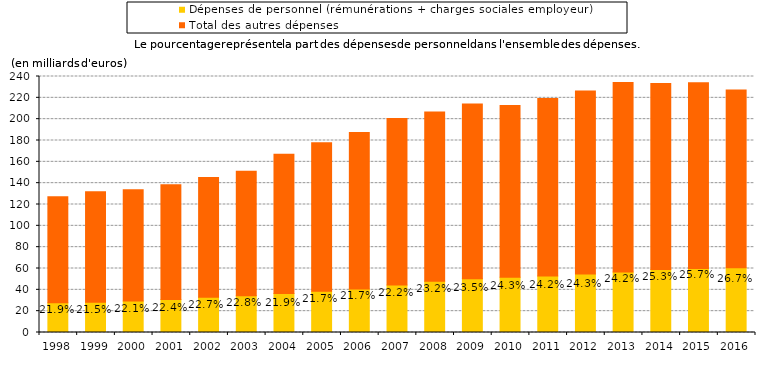
| Category | Dépenses de personnel (rémunérations + charges sociales employeur) | Total des autres dépenses |                                                  % |
|---|---|---|---|
| 1998.0 | 27.84 | 99.428 | 0.219 |
| 1999.0 | 28.43 | 103.617 | 0.215 |
| 2000.0 | 29.502 | 104.27 | 0.221 |
| 2001.0 | 30.977 | 107.475 | 0.224 |
| 2002.0 | 32.984 | 112.367 | 0.227 |
| 2003.0 | 34.543 | 116.645 | 0.228 |
| 2004.0 | 36.621 | 130.39 | 0.219 |
| 2005.0 | 38.569 | 139.218 | 0.217 |
| 2006.0 | 40.7 | 146.866 | 0.217 |
| 2007.0 | 44.509 | 156.081 | 0.222 |
| 2008.0 | 48.035 | 158.785 | 0.232 |
| 2009.0 | 50.3 | 163.93 | 0.235 |
| 2010.0 | 51.74 | 161.08 | 0.243 |
| 2011.0 | 52.998 | 166.387 | 0.242 |
| 2012.0 | 54.896 | 171.477 | 0.243 |
| 2013.0 | 56.628 | 177.674 | 0.242 |
| 2014.0 | 58.976 | 174.391 | 0.253 |
| 2015.0 | 60.116 | 174.085 | 0.257 |
| 2016.0 | 60.675 | 166.634 | 0.267 |